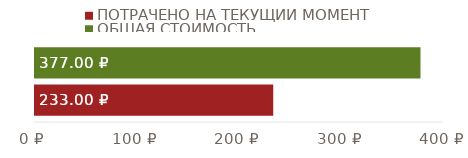
| Category | ПОТРАЧЕНО НА ТЕКУЩИЙ МОМЕНТ | ОБЩАЯ СТОИМОСТЬ |
|---|---|---|
| ИТОГИ | 233 | 377 |